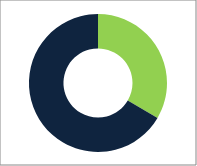
| Category | Series 0 |
|---|---|
| 0 | 315 |
| 1 | 627 |